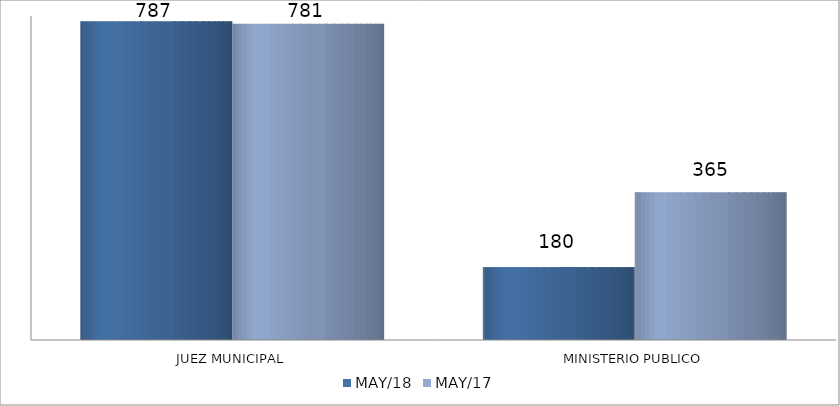
| Category | MAY/18 | MAY/17 |
|---|---|---|
| JUEZ MUNICIPAL | 787 | 781 |
| MINISTERIO PUBLICO | 180 | 365 |